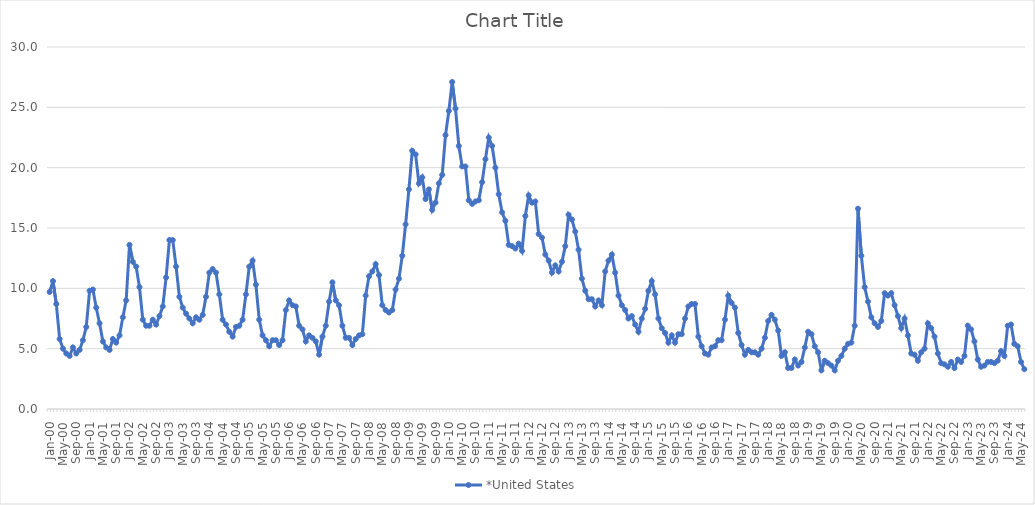
| Category | *United States | Alaska | Alabama | Arkansas | Arizona | California | Colorado | Connecticut | Delaware | Florida | Georgia | Hawaii | Iowa | Idaho | Illinois | Indiana | Kansas | Kentucky | Louisiana | Massachusetts | Maryland | Maine | Michigan | Minnesota | Missouri | Mississippi | Montana | North Carolina | North Dakota | Nebraska | New Hampshire | New Jersey | New Mexico | Nevada | New York | Ohio | Oklahoma | Oregon | Pennsylvania | Rhode Island | South Carolina | South Dakota | Tennessee | Texas | Utah | Virginia | Vermont | Washington | Wisconsin | West Virginia | Wyoming |
|---|---|---|---|---|---|---|---|---|---|---|---|---|---|---|---|---|---|---|---|---|---|---|---|---|---|---|---|---|---|---|---|---|---|---|---|---|---|---|---|---|---|---|---|---|---|---|---|---|---|---|---|
| Jan-00 | 9.7 |  |  |  |  |  |  |  |  |  |  |  |  |  |  |  |  |  |  |  |  |  |  |  |  |  |  |  |  |  |  |  |  |  |  |  |  |  |  |  |  |  |  |  |  |  |  |  |  |  |  |
| Feb-00 | 10.6 |  |  |  |  |  |  |  |  |  |  |  |  |  |  |  |  |  |  |  |  |  |  |  |  |  |  |  |  |  |  |  |  |  |  |  |  |  |  |  |  |  |  |  |  |  |  |  |  |  |  |
| Mar-00 | 8.7 |  |  |  |  |  |  |  |  |  |  |  |  |  |  |  |  |  |  |  |  |  |  |  |  |  |  |  |  |  |  |  |  |  |  |  |  |  |  |  |  |  |  |  |  |  |  |  |  |  |  |
| Apr-00 | 5.8 |  |  |  |  |  |  |  |  |  |  |  |  |  |  |  |  |  |  |  |  |  |  |  |  |  |  |  |  |  |  |  |  |  |  |  |  |  |  |  |  |  |  |  |  |  |  |  |  |  |  |
| May-00 | 5 |  |  |  |  |  |  |  |  |  |  |  |  |  |  |  |  |  |  |  |  |  |  |  |  |  |  |  |  |  |  |  |  |  |  |  |  |  |  |  |  |  |  |  |  |  |  |  |  |  |  |
| Jun-00 | 4.6 |  |  |  |  |  |  |  |  |  |  |  |  |  |  |  |  |  |  |  |  |  |  |  |  |  |  |  |  |  |  |  |  |  |  |  |  |  |  |  |  |  |  |  |  |  |  |  |  |  |  |
| Jul-00 | 4.4 |  |  |  |  |  |  |  |  |  |  |  |  |  |  |  |  |  |  |  |  |  |  |  |  |  |  |  |  |  |  |  |  |  |  |  |  |  |  |  |  |  |  |  |  |  |  |  |  |  |  |
| Aug-00 | 5.1 |  |  |  |  |  |  |  |  |  |  |  |  |  |  |  |  |  |  |  |  |  |  |  |  |  |  |  |  |  |  |  |  |  |  |  |  |  |  |  |  |  |  |  |  |  |  |  |  |  |  |
| Sep-00 | 4.6 |  |  |  |  |  |  |  |  |  |  |  |  |  |  |  |  |  |  |  |  |  |  |  |  |  |  |  |  |  |  |  |  |  |  |  |  |  |  |  |  |  |  |  |  |  |  |  |  |  |  |
| Oct-00 | 4.9 |  |  |  |  |  |  |  |  |  |  |  |  |  |  |  |  |  |  |  |  |  |  |  |  |  |  |  |  |  |  |  |  |  |  |  |  |  |  |  |  |  |  |  |  |  |  |  |  |  |  |
| Nov-00 | 5.7 |  |  |  |  |  |  |  |  |  |  |  |  |  |  |  |  |  |  |  |  |  |  |  |  |  |  |  |  |  |  |  |  |  |  |  |  |  |  |  |  |  |  |  |  |  |  |  |  |  |  |
| Dec-00 | 6.8 |  |  |  |  |  |  |  |  |  |  |  |  |  |  |  |  |  |  |  |  |  |  |  |  |  |  |  |  |  |  |  |  |  |  |  |  |  |  |  |  |  |  |  |  |  |  |  |  |  |  |
| Jan-01 | 9.8 |  |  |  |  |  |  |  |  |  |  |  |  |  |  |  |  |  |  |  |  |  |  |  |  |  |  |  |  |  |  |  |  |  |  |  |  |  |  |  |  |  |  |  |  |  |  |  |  |  |  |
| Feb-01 | 9.9 |  |  |  |  |  |  |  |  |  |  |  |  |  |  |  |  |  |  |  |  |  |  |  |  |  |  |  |  |  |  |  |  |  |  |  |  |  |  |  |  |  |  |  |  |  |  |  |  |  |  |
| Mar-01 | 8.4 |  |  |  |  |  |  |  |  |  |  |  |  |  |  |  |  |  |  |  |  |  |  |  |  |  |  |  |  |  |  |  |  |  |  |  |  |  |  |  |  |  |  |  |  |  |  |  |  |  |  |
| Apr-01 | 7.1 |  |  |  |  |  |  |  |  |  |  |  |  |  |  |  |  |  |  |  |  |  |  |  |  |  |  |  |  |  |  |  |  |  |  |  |  |  |  |  |  |  |  |  |  |  |  |  |  |  |  |
| May-01 | 5.6 |  |  |  |  |  |  |  |  |  |  |  |  |  |  |  |  |  |  |  |  |  |  |  |  |  |  |  |  |  |  |  |  |  |  |  |  |  |  |  |  |  |  |  |  |  |  |  |  |  |  |
| Jun-01 | 5.1 |  |  |  |  |  |  |  |  |  |  |  |  |  |  |  |  |  |  |  |  |  |  |  |  |  |  |  |  |  |  |  |  |  |  |  |  |  |  |  |  |  |  |  |  |  |  |  |  |  |  |
| Jul-01 | 4.9 |  |  |  |  |  |  |  |  |  |  |  |  |  |  |  |  |  |  |  |  |  |  |  |  |  |  |  |  |  |  |  |  |  |  |  |  |  |  |  |  |  |  |  |  |  |  |  |  |  |  |
| Aug-01 | 5.8 |  |  |  |  |  |  |  |  |  |  |  |  |  |  |  |  |  |  |  |  |  |  |  |  |  |  |  |  |  |  |  |  |  |  |  |  |  |  |  |  |  |  |  |  |  |  |  |  |  |  |
| Sep-01 | 5.5 |  |  |  |  |  |  |  |  |  |  |  |  |  |  |  |  |  |  |  |  |  |  |  |  |  |  |  |  |  |  |  |  |  |  |  |  |  |  |  |  |  |  |  |  |  |  |  |  |  |  |
| Oct-01 | 6.1 |  |  |  |  |  |  |  |  |  |  |  |  |  |  |  |  |  |  |  |  |  |  |  |  |  |  |  |  |  |  |  |  |  |  |  |  |  |  |  |  |  |  |  |  |  |  |  |  |  |  |
| Nov-01 | 7.6 |  |  |  |  |  |  |  |  |  |  |  |  |  |  |  |  |  |  |  |  |  |  |  |  |  |  |  |  |  |  |  |  |  |  |  |  |  |  |  |  |  |  |  |  |  |  |  |  |  |  |
| Dec-01 | 9 |  |  |  |  |  |  |  |  |  |  |  |  |  |  |  |  |  |  |  |  |  |  |  |  |  |  |  |  |  |  |  |  |  |  |  |  |  |  |  |  |  |  |  |  |  |  |  |  |  |  |
| Jan-02 | 13.6 |  |  |  |  |  |  |  |  |  |  |  |  |  |  |  |  |  |  |  |  |  |  |  |  |  |  |  |  |  |  |  |  |  |  |  |  |  |  |  |  |  |  |  |  |  |  |  |  |  |  |
| Feb-02 | 12.2 |  |  |  |  |  |  |  |  |  |  |  |  |  |  |  |  |  |  |  |  |  |  |  |  |  |  |  |  |  |  |  |  |  |  |  |  |  |  |  |  |  |  |  |  |  |  |  |  |  |  |
| Mar-02 | 11.8 |  |  |  |  |  |  |  |  |  |  |  |  |  |  |  |  |  |  |  |  |  |  |  |  |  |  |  |  |  |  |  |  |  |  |  |  |  |  |  |  |  |  |  |  |  |  |  |  |  |  |
| Apr-02 | 10.1 |  |  |  |  |  |  |  |  |  |  |  |  |  |  |  |  |  |  |  |  |  |  |  |  |  |  |  |  |  |  |  |  |  |  |  |  |  |  |  |  |  |  |  |  |  |  |  |  |  |  |
| May-02 | 7.4 |  |  |  |  |  |  |  |  |  |  |  |  |  |  |  |  |  |  |  |  |  |  |  |  |  |  |  |  |  |  |  |  |  |  |  |  |  |  |  |  |  |  |  |  |  |  |  |  |  |  |
| Jun-02 | 6.9 |  |  |  |  |  |  |  |  |  |  |  |  |  |  |  |  |  |  |  |  |  |  |  |  |  |  |  |  |  |  |  |  |  |  |  |  |  |  |  |  |  |  |  |  |  |  |  |  |  |  |
| Jul-02 | 6.9 |  |  |  |  |  |  |  |  |  |  |  |  |  |  |  |  |  |  |  |  |  |  |  |  |  |  |  |  |  |  |  |  |  |  |  |  |  |  |  |  |  |  |  |  |  |  |  |  |  |  |
| Aug-02 | 7.4 |  |  |  |  |  |  |  |  |  |  |  |  |  |  |  |  |  |  |  |  |  |  |  |  |  |  |  |  |  |  |  |  |  |  |  |  |  |  |  |  |  |  |  |  |  |  |  |  |  |  |
| Sep-02 | 7 |  |  |  |  |  |  |  |  |  |  |  |  |  |  |  |  |  |  |  |  |  |  |  |  |  |  |  |  |  |  |  |  |  |  |  |  |  |  |  |  |  |  |  |  |  |  |  |  |  |  |
| Oct-02 | 7.7 |  |  |  |  |  |  |  |  |  |  |  |  |  |  |  |  |  |  |  |  |  |  |  |  |  |  |  |  |  |  |  |  |  |  |  |  |  |  |  |  |  |  |  |  |  |  |  |  |  |  |
| Nov-02 | 8.5 |  |  |  |  |  |  |  |  |  |  |  |  |  |  |  |  |  |  |  |  |  |  |  |  |  |  |  |  |  |  |  |  |  |  |  |  |  |  |  |  |  |  |  |  |  |  |  |  |  |  |
| Dec-02 | 10.9 |  |  |  |  |  |  |  |  |  |  |  |  |  |  |  |  |  |  |  |  |  |  |  |  |  |  |  |  |  |  |  |  |  |  |  |  |  |  |  |  |  |  |  |  |  |  |  |  |  |  |
| Jan-03 | 14 |  |  |  |  |  |  |  |  |  |  |  |  |  |  |  |  |  |  |  |  |  |  |  |  |  |  |  |  |  |  |  |  |  |  |  |  |  |  |  |  |  |  |  |  |  |  |  |  |  |  |
| Feb-03 | 14 |  |  |  |  |  |  |  |  |  |  |  |  |  |  |  |  |  |  |  |  |  |  |  |  |  |  |  |  |  |  |  |  |  |  |  |  |  |  |  |  |  |  |  |  |  |  |  |  |  |  |
| Mar-03 | 11.8 |  |  |  |  |  |  |  |  |  |  |  |  |  |  |  |  |  |  |  |  |  |  |  |  |  |  |  |  |  |  |  |  |  |  |  |  |  |  |  |  |  |  |  |  |  |  |  |  |  |  |
| Apr-03 | 9.3 |  |  |  |  |  |  |  |  |  |  |  |  |  |  |  |  |  |  |  |  |  |  |  |  |  |  |  |  |  |  |  |  |  |  |  |  |  |  |  |  |  |  |  |  |  |  |  |  |  |  |
| May-03 | 8.4 |  |  |  |  |  |  |  |  |  |  |  |  |  |  |  |  |  |  |  |  |  |  |  |  |  |  |  |  |  |  |  |  |  |  |  |  |  |  |  |  |  |  |  |  |  |  |  |  |  |  |
| Jun-03 | 7.9 |  |  |  |  |  |  |  |  |  |  |  |  |  |  |  |  |  |  |  |  |  |  |  |  |  |  |  |  |  |  |  |  |  |  |  |  |  |  |  |  |  |  |  |  |  |  |  |  |  |  |
| Jul-03 | 7.5 |  |  |  |  |  |  |  |  |  |  |  |  |  |  |  |  |  |  |  |  |  |  |  |  |  |  |  |  |  |  |  |  |  |  |  |  |  |  |  |  |  |  |  |  |  |  |  |  |  |  |
| Aug-03 | 7.1 |  |  |  |  |  |  |  |  |  |  |  |  |  |  |  |  |  |  |  |  |  |  |  |  |  |  |  |  |  |  |  |  |  |  |  |  |  |  |  |  |  |  |  |  |  |  |  |  |  |  |
| Sep-03 | 7.6 |  |  |  |  |  |  |  |  |  |  |  |  |  |  |  |  |  |  |  |  |  |  |  |  |  |  |  |  |  |  |  |  |  |  |  |  |  |  |  |  |  |  |  |  |  |  |  |  |  |  |
| Oct-03 | 7.4 |  |  |  |  |  |  |  |  |  |  |  |  |  |  |  |  |  |  |  |  |  |  |  |  |  |  |  |  |  |  |  |  |  |  |  |  |  |  |  |  |  |  |  |  |  |  |  |  |  |  |
| Nov-03 | 7.8 |  |  |  |  |  |  |  |  |  |  |  |  |  |  |  |  |  |  |  |  |  |  |  |  |  |  |  |  |  |  |  |  |  |  |  |  |  |  |  |  |  |  |  |  |  |  |  |  |  |  |
| Dec-03 | 9.3 |  |  |  |  |  |  |  |  |  |  |  |  |  |  |  |  |  |  |  |  |  |  |  |  |  |  |  |  |  |  |  |  |  |  |  |  |  |  |  |  |  |  |  |  |  |  |  |  |  |  |
| Jan-04 | 11.3 |  |  |  |  |  |  |  |  |  |  |  |  |  |  |  |  |  |  |  |  |  |  |  |  |  |  |  |  |  |  |  |  |  |  |  |  |  |  |  |  |  |  |  |  |  |  |  |  |  |  |
| Feb-04 | 11.6 |  |  |  |  |  |  |  |  |  |  |  |  |  |  |  |  |  |  |  |  |  |  |  |  |  |  |  |  |  |  |  |  |  |  |  |  |  |  |  |  |  |  |  |  |  |  |  |  |  |  |
| Mar-04 | 11.3 |  |  |  |  |  |  |  |  |  |  |  |  |  |  |  |  |  |  |  |  |  |  |  |  |  |  |  |  |  |  |  |  |  |  |  |  |  |  |  |  |  |  |  |  |  |  |  |  |  |  |
| Apr-04 | 9.5 |  |  |  |  |  |  |  |  |  |  |  |  |  |  |  |  |  |  |  |  |  |  |  |  |  |  |  |  |  |  |  |  |  |  |  |  |  |  |  |  |  |  |  |  |  |  |  |  |  |  |
| May-04 | 7.4 |  |  |  |  |  |  |  |  |  |  |  |  |  |  |  |  |  |  |  |  |  |  |  |  |  |  |  |  |  |  |  |  |  |  |  |  |  |  |  |  |  |  |  |  |  |  |  |  |  |  |
| Jun-04 | 7 |  |  |  |  |  |  |  |  |  |  |  |  |  |  |  |  |  |  |  |  |  |  |  |  |  |  |  |  |  |  |  |  |  |  |  |  |  |  |  |  |  |  |  |  |  |  |  |  |  |  |
| Jul-04 | 6.4 |  |  |  |  |  |  |  |  |  |  |  |  |  |  |  |  |  |  |  |  |  |  |  |  |  |  |  |  |  |  |  |  |  |  |  |  |  |  |  |  |  |  |  |  |  |  |  |  |  |  |
| Aug-04 | 6 |  |  |  |  |  |  |  |  |  |  |  |  |  |  |  |  |  |  |  |  |  |  |  |  |  |  |  |  |  |  |  |  |  |  |  |  |  |  |  |  |  |  |  |  |  |  |  |  |  |  |
| Sep-04 | 6.8 |  |  |  |  |  |  |  |  |  |  |  |  |  |  |  |  |  |  |  |  |  |  |  |  |  |  |  |  |  |  |  |  |  |  |  |  |  |  |  |  |  |  |  |  |  |  |  |  |  |  |
| Oct-04 | 6.9 |  |  |  |  |  |  |  |  |  |  |  |  |  |  |  |  |  |  |  |  |  |  |  |  |  |  |  |  |  |  |  |  |  |  |  |  |  |  |  |  |  |  |  |  |  |  |  |  |  |  |
| Nov-04 | 7.4 |  |  |  |  |  |  |  |  |  |  |  |  |  |  |  |  |  |  |  |  |  |  |  |  |  |  |  |  |  |  |  |  |  |  |  |  |  |  |  |  |  |  |  |  |  |  |  |  |  |  |
| Dec-04 | 9.5 |  |  |  |  |  |  |  |  |  |  |  |  |  |  |  |  |  |  |  |  |  |  |  |  |  |  |  |  |  |  |  |  |  |  |  |  |  |  |  |  |  |  |  |  |  |  |  |  |  |  |
| Jan-05 | 11.8 |  |  |  |  |  |  |  |  |  |  |  |  |  |  |  |  |  |  |  |  |  |  |  |  |  |  |  |  |  |  |  |  |  |  |  |  |  |  |  |  |  |  |  |  |  |  |  |  |  |  |
| Feb-05 | 12.3 |  |  |  |  |  |  |  |  |  |  |  |  |  |  |  |  |  |  |  |  |  |  |  |  |  |  |  |  |  |  |  |  |  |  |  |  |  |  |  |  |  |  |  |  |  |  |  |  |  |  |
| Mar-05 | 10.3 |  |  |  |  |  |  |  |  |  |  |  |  |  |  |  |  |  |  |  |  |  |  |  |  |  |  |  |  |  |  |  |  |  |  |  |  |  |  |  |  |  |  |  |  |  |  |  |  |  |  |
| Apr-05 | 7.4 |  |  |  |  |  |  |  |  |  |  |  |  |  |  |  |  |  |  |  |  |  |  |  |  |  |  |  |  |  |  |  |  |  |  |  |  |  |  |  |  |  |  |  |  |  |  |  |  |  |  |
| May-05 | 6.1 |  |  |  |  |  |  |  |  |  |  |  |  |  |  |  |  |  |  |  |  |  |  |  |  |  |  |  |  |  |  |  |  |  |  |  |  |  |  |  |  |  |  |  |  |  |  |  |  |  |  |
| Jun-05 | 5.7 |  |  |  |  |  |  |  |  |  |  |  |  |  |  |  |  |  |  |  |  |  |  |  |  |  |  |  |  |  |  |  |  |  |  |  |  |  |  |  |  |  |  |  |  |  |  |  |  |  |  |
| Jul-05 | 5.2 |  |  |  |  |  |  |  |  |  |  |  |  |  |  |  |  |  |  |  |  |  |  |  |  |  |  |  |  |  |  |  |  |  |  |  |  |  |  |  |  |  |  |  |  |  |  |  |  |  |  |
| Aug-05 | 5.7 |  |  |  |  |  |  |  |  |  |  |  |  |  |  |  |  |  |  |  |  |  |  |  |  |  |  |  |  |  |  |  |  |  |  |  |  |  |  |  |  |  |  |  |  |  |  |  |  |  |  |
| Sep-05 | 5.7 |  |  |  |  |  |  |  |  |  |  |  |  |  |  |  |  |  |  |  |  |  |  |  |  |  |  |  |  |  |  |  |  |  |  |  |  |  |  |  |  |  |  |  |  |  |  |  |  |  |  |
| Oct-05 | 5.3 |  |  |  |  |  |  |  |  |  |  |  |  |  |  |  |  |  |  |  |  |  |  |  |  |  |  |  |  |  |  |  |  |  |  |  |  |  |  |  |  |  |  |  |  |  |  |  |  |  |  |
| Nov-05 | 5.7 |  |  |  |  |  |  |  |  |  |  |  |  |  |  |  |  |  |  |  |  |  |  |  |  |  |  |  |  |  |  |  |  |  |  |  |  |  |  |  |  |  |  |  |  |  |  |  |  |  |  |
| Dec-05 | 8.2 |  |  |  |  |  |  |  |  |  |  |  |  |  |  |  |  |  |  |  |  |  |  |  |  |  |  |  |  |  |  |  |  |  |  |  |  |  |  |  |  |  |  |  |  |  |  |  |  |  |  |
| Jan-06 | 9 |  |  |  |  |  |  |  |  |  |  |  |  |  |  |  |  |  |  |  |  |  |  |  |  |  |  |  |  |  |  |  |  |  |  |  |  |  |  |  |  |  |  |  |  |  |  |  |  |  |  |
| Feb-06 | 8.6 |  |  |  |  |  |  |  |  |  |  |  |  |  |  |  |  |  |  |  |  |  |  |  |  |  |  |  |  |  |  |  |  |  |  |  |  |  |  |  |  |  |  |  |  |  |  |  |  |  |  |
| Mar-06 | 8.5 |  |  |  |  |  |  |  |  |  |  |  |  |  |  |  |  |  |  |  |  |  |  |  |  |  |  |  |  |  |  |  |  |  |  |  |  |  |  |  |  |  |  |  |  |  |  |  |  |  |  |
| Apr-06 | 6.9 |  |  |  |  |  |  |  |  |  |  |  |  |  |  |  |  |  |  |  |  |  |  |  |  |  |  |  |  |  |  |  |  |  |  |  |  |  |  |  |  |  |  |  |  |  |  |  |  |  |  |
| May-06 | 6.6 |  |  |  |  |  |  |  |  |  |  |  |  |  |  |  |  |  |  |  |  |  |  |  |  |  |  |  |  |  |  |  |  |  |  |  |  |  |  |  |  |  |  |  |  |  |  |  |  |  |  |
| Jun-06 | 5.6 |  |  |  |  |  |  |  |  |  |  |  |  |  |  |  |  |  |  |  |  |  |  |  |  |  |  |  |  |  |  |  |  |  |  |  |  |  |  |  |  |  |  |  |  |  |  |  |  |  |  |
| Jul-06 | 6.1 |  |  |  |  |  |  |  |  |  |  |  |  |  |  |  |  |  |  |  |  |  |  |  |  |  |  |  |  |  |  |  |  |  |  |  |  |  |  |  |  |  |  |  |  |  |  |  |  |  |  |
| Aug-06 | 5.9 |  |  |  |  |  |  |  |  |  |  |  |  |  |  |  |  |  |  |  |  |  |  |  |  |  |  |  |  |  |  |  |  |  |  |  |  |  |  |  |  |  |  |  |  |  |  |  |  |  |  |
| Sep-06 | 5.6 |  |  |  |  |  |  |  |  |  |  |  |  |  |  |  |  |  |  |  |  |  |  |  |  |  |  |  |  |  |  |  |  |  |  |  |  |  |  |  |  |  |  |  |  |  |  |  |  |  |  |
| Oct-06 | 4.5 |  |  |  |  |  |  |  |  |  |  |  |  |  |  |  |  |  |  |  |  |  |  |  |  |  |  |  |  |  |  |  |  |  |  |  |  |  |  |  |  |  |  |  |  |  |  |  |  |  |  |
| Nov-06 | 6 |  |  |  |  |  |  |  |  |  |  |  |  |  |  |  |  |  |  |  |  |  |  |  |  |  |  |  |  |  |  |  |  |  |  |  |  |  |  |  |  |  |  |  |  |  |  |  |  |  |  |
| Dec-06 | 6.9 |  |  |  |  |  |  |  |  |  |  |  |  |  |  |  |  |  |  |  |  |  |  |  |  |  |  |  |  |  |  |  |  |  |  |  |  |  |  |  |  |  |  |  |  |  |  |  |  |  |  |
| Jan-07 | 8.9 |  |  |  |  |  |  |  |  |  |  |  |  |  |  |  |  |  |  |  |  |  |  |  |  |  |  |  |  |  |  |  |  |  |  |  |  |  |  |  |  |  |  |  |  |  |  |  |  |  |  |
| Feb-07 | 10.5 |  |  |  |  |  |  |  |  |  |  |  |  |  |  |  |  |  |  |  |  |  |  |  |  |  |  |  |  |  |  |  |  |  |  |  |  |  |  |  |  |  |  |  |  |  |  |  |  |  |  |
| Mar-07 | 9 |  |  |  |  |  |  |  |  |  |  |  |  |  |  |  |  |  |  |  |  |  |  |  |  |  |  |  |  |  |  |  |  |  |  |  |  |  |  |  |  |  |  |  |  |  |  |  |  |  |  |
| Apr-07 | 8.6 |  |  |  |  |  |  |  |  |  |  |  |  |  |  |  |  |  |  |  |  |  |  |  |  |  |  |  |  |  |  |  |  |  |  |  |  |  |  |  |  |  |  |  |  |  |  |  |  |  |  |
| May-07 | 6.9 |  |  |  |  |  |  |  |  |  |  |  |  |  |  |  |  |  |  |  |  |  |  |  |  |  |  |  |  |  |  |  |  |  |  |  |  |  |  |  |  |  |  |  |  |  |  |  |  |  |  |
| Jun-07 | 5.9 |  |  |  |  |  |  |  |  |  |  |  |  |  |  |  |  |  |  |  |  |  |  |  |  |  |  |  |  |  |  |  |  |  |  |  |  |  |  |  |  |  |  |  |  |  |  |  |  |  |  |
| Jul-07 | 5.9 |  |  |  |  |  |  |  |  |  |  |  |  |  |  |  |  |  |  |  |  |  |  |  |  |  |  |  |  |  |  |  |  |  |  |  |  |  |  |  |  |  |  |  |  |  |  |  |  |  |  |
| Aug-07 | 5.3 |  |  |  |  |  |  |  |  |  |  |  |  |  |  |  |  |  |  |  |  |  |  |  |  |  |  |  |  |  |  |  |  |  |  |  |  |  |  |  |  |  |  |  |  |  |  |  |  |  |  |
| Sep-07 | 5.8 |  |  |  |  |  |  |  |  |  |  |  |  |  |  |  |  |  |  |  |  |  |  |  |  |  |  |  |  |  |  |  |  |  |  |  |  |  |  |  |  |  |  |  |  |  |  |  |  |  |  |
| Oct-07 | 6.1 |  |  |  |  |  |  |  |  |  |  |  |  |  |  |  |  |  |  |  |  |  |  |  |  |  |  |  |  |  |  |  |  |  |  |  |  |  |  |  |  |  |  |  |  |  |  |  |  |  |  |
| Nov-07 | 6.2 |  |  |  |  |  |  |  |  |  |  |  |  |  |  |  |  |  |  |  |  |  |  |  |  |  |  |  |  |  |  |  |  |  |  |  |  |  |  |  |  |  |  |  |  |  |  |  |  |  |  |
| Dec-07 | 9.4 |  |  |  |  |  |  |  |  |  |  |  |  |  |  |  |  |  |  |  |  |  |  |  |  |  |  |  |  |  |  |  |  |  |  |  |  |  |  |  |  |  |  |  |  |  |  |  |  |  |  |
| Jan-08 | 11 |  |  |  |  |  |  |  |  |  |  |  |  |  |  |  |  |  |  |  |  |  |  |  |  |  |  |  |  |  |  |  |  |  |  |  |  |  |  |  |  |  |  |  |  |  |  |  |  |  |  |
| Feb-08 | 11.4 |  |  |  |  |  |  |  |  |  |  |  |  |  |  |  |  |  |  |  |  |  |  |  |  |  |  |  |  |  |  |  |  |  |  |  |  |  |  |  |  |  |  |  |  |  |  |  |  |  |  |
| Mar-08 | 12 |  |  |  |  |  |  |  |  |  |  |  |  |  |  |  |  |  |  |  |  |  |  |  |  |  |  |  |  |  |  |  |  |  |  |  |  |  |  |  |  |  |  |  |  |  |  |  |  |  |  |
| Apr-08 | 11.1 |  |  |  |  |  |  |  |  |  |  |  |  |  |  |  |  |  |  |  |  |  |  |  |  |  |  |  |  |  |  |  |  |  |  |  |  |  |  |  |  |  |  |  |  |  |  |  |  |  |  |
| May-08 | 8.6 |  |  |  |  |  |  |  |  |  |  |  |  |  |  |  |  |  |  |  |  |  |  |  |  |  |  |  |  |  |  |  |  |  |  |  |  |  |  |  |  |  |  |  |  |  |  |  |  |  |  |
| Jun-08 | 8.2 |  |  |  |  |  |  |  |  |  |  |  |  |  |  |  |  |  |  |  |  |  |  |  |  |  |  |  |  |  |  |  |  |  |  |  |  |  |  |  |  |  |  |  |  |  |  |  |  |  |  |
| Jul-08 | 8 |  |  |  |  |  |  |  |  |  |  |  |  |  |  |  |  |  |  |  |  |  |  |  |  |  |  |  |  |  |  |  |  |  |  |  |  |  |  |  |  |  |  |  |  |  |  |  |  |  |  |
| Aug-08 | 8.2 |  |  |  |  |  |  |  |  |  |  |  |  |  |  |  |  |  |  |  |  |  |  |  |  |  |  |  |  |  |  |  |  |  |  |  |  |  |  |  |  |  |  |  |  |  |  |  |  |  |  |
| Sep-08 | 9.9 |  |  |  |  |  |  |  |  |  |  |  |  |  |  |  |  |  |  |  |  |  |  |  |  |  |  |  |  |  |  |  |  |  |  |  |  |  |  |  |  |  |  |  |  |  |  |  |  |  |  |
| Oct-08 | 10.8 |  |  |  |  |  |  |  |  |  |  |  |  |  |  |  |  |  |  |  |  |  |  |  |  |  |  |  |  |  |  |  |  |  |  |  |  |  |  |  |  |  |  |  |  |  |  |  |  |  |  |
| Nov-08 | 12.7 |  |  |  |  |  |  |  |  |  |  |  |  |  |  |  |  |  |  |  |  |  |  |  |  |  |  |  |  |  |  |  |  |  |  |  |  |  |  |  |  |  |  |  |  |  |  |  |  |  |  |
| Dec-08 | 15.3 |  |  |  |  |  |  |  |  |  |  |  |  |  |  |  |  |  |  |  |  |  |  |  |  |  |  |  |  |  |  |  |  |  |  |  |  |  |  |  |  |  |  |  |  |  |  |  |  |  |  |
| Jan-09 | 18.2 |  |  |  |  |  |  |  |  |  |  |  |  |  |  |  |  |  |  |  |  |  |  |  |  |  |  |  |  |  |  |  |  |  |  |  |  |  |  |  |  |  |  |  |  |  |  |  |  |  |  |
| Feb-09 | 21.4 |  |  |  |  |  |  |  |  |  |  |  |  |  |  |  |  |  |  |  |  |  |  |  |  |  |  |  |  |  |  |  |  |  |  |  |  |  |  |  |  |  |  |  |  |  |  |  |  |  |  |
| Mar-09 | 21.1 |  |  |  |  |  |  |  |  |  |  |  |  |  |  |  |  |  |  |  |  |  |  |  |  |  |  |  |  |  |  |  |  |  |  |  |  |  |  |  |  |  |  |  |  |  |  |  |  |  |  |
| Apr-09 | 18.7 |  |  |  |  |  |  |  |  |  |  |  |  |  |  |  |  |  |  |  |  |  |  |  |  |  |  |  |  |  |  |  |  |  |  |  |  |  |  |  |  |  |  |  |  |  |  |  |  |  |  |
| May-09 | 19.2 |  |  |  |  |  |  |  |  |  |  |  |  |  |  |  |  |  |  |  |  |  |  |  |  |  |  |  |  |  |  |  |  |  |  |  |  |  |  |  |  |  |  |  |  |  |  |  |  |  |  |
| Jun-09 | 17.4 |  |  |  |  |  |  |  |  |  |  |  |  |  |  |  |  |  |  |  |  |  |  |  |  |  |  |  |  |  |  |  |  |  |  |  |  |  |  |  |  |  |  |  |  |  |  |  |  |  |  |
| Jul-09 | 18.2 |  |  |  |  |  |  |  |  |  |  |  |  |  |  |  |  |  |  |  |  |  |  |  |  |  |  |  |  |  |  |  |  |  |  |  |  |  |  |  |  |  |  |  |  |  |  |  |  |  |  |
| Aug-09 | 16.5 |  |  |  |  |  |  |  |  |  |  |  |  |  |  |  |  |  |  |  |  |  |  |  |  |  |  |  |  |  |  |  |  |  |  |  |  |  |  |  |  |  |  |  |  |  |  |  |  |  |  |
| Sep-09 | 17.1 |  |  |  |  |  |  |  |  |  |  |  |  |  |  |  |  |  |  |  |  |  |  |  |  |  |  |  |  |  |  |  |  |  |  |  |  |  |  |  |  |  |  |  |  |  |  |  |  |  |  |
| Oct-09 | 18.7 |  |  |  |  |  |  |  |  |  |  |  |  |  |  |  |  |  |  |  |  |  |  |  |  |  |  |  |  |  |  |  |  |  |  |  |  |  |  |  |  |  |  |  |  |  |  |  |  |  |  |
| Nov-09 | 19.4 |  |  |  |  |  |  |  |  |  |  |  |  |  |  |  |  |  |  |  |  |  |  |  |  |  |  |  |  |  |  |  |  |  |  |  |  |  |  |  |  |  |  |  |  |  |  |  |  |  |  |
| Dec-09 | 22.7 |  |  |  |  |  |  |  |  |  |  |  |  |  |  |  |  |  |  |  |  |  |  |  |  |  |  |  |  |  |  |  |  |  |  |  |  |  |  |  |  |  |  |  |  |  |  |  |  |  |  |
| Jan-10 | 24.7 |  |  |  |  |  |  |  |  |  |  |  |  |  |  |  |  |  |  |  |  |  |  |  |  |  |  |  |  |  |  |  |  |  |  |  |  |  |  |  |  |  |  |  |  |  |  |  |  |  |  |
| Feb-10 | 27.1 |  |  |  |  |  |  |  |  |  |  |  |  |  |  |  |  |  |  |  |  |  |  |  |  |  |  |  |  |  |  |  |  |  |  |  |  |  |  |  |  |  |  |  |  |  |  |  |  |  |  |
| Mar-10 | 24.9 |  |  |  |  |  |  |  |  |  |  |  |  |  |  |  |  |  |  |  |  |  |  |  |  |  |  |  |  |  |  |  |  |  |  |  |  |  |  |  |  |  |  |  |  |  |  |  |  |  |  |
| Apr-10 | 21.8 |  |  |  |  |  |  |  |  |  |  |  |  |  |  |  |  |  |  |  |  |  |  |  |  |  |  |  |  |  |  |  |  |  |  |  |  |  |  |  |  |  |  |  |  |  |  |  |  |  |  |
| May-10 | 20.1 |  |  |  |  |  |  |  |  |  |  |  |  |  |  |  |  |  |  |  |  |  |  |  |  |  |  |  |  |  |  |  |  |  |  |  |  |  |  |  |  |  |  |  |  |  |  |  |  |  |  |
| Jun-10 | 20.1 |  |  |  |  |  |  |  |  |  |  |  |  |  |  |  |  |  |  |  |  |  |  |  |  |  |  |  |  |  |  |  |  |  |  |  |  |  |  |  |  |  |  |  |  |  |  |  |  |  |  |
| Jul-10 | 17.3 |  |  |  |  |  |  |  |  |  |  |  |  |  |  |  |  |  |  |  |  |  |  |  |  |  |  |  |  |  |  |  |  |  |  |  |  |  |  |  |  |  |  |  |  |  |  |  |  |  |  |
| Aug-10 | 17 |  |  |  |  |  |  |  |  |  |  |  |  |  |  |  |  |  |  |  |  |  |  |  |  |  |  |  |  |  |  |  |  |  |  |  |  |  |  |  |  |  |  |  |  |  |  |  |  |  |  |
| Sep-10 | 17.2 |  |  |  |  |  |  |  |  |  |  |  |  |  |  |  |  |  |  |  |  |  |  |  |  |  |  |  |  |  |  |  |  |  |  |  |  |  |  |  |  |  |  |  |  |  |  |  |  |  |  |
| Oct-10 | 17.3 |  |  |  |  |  |  |  |  |  |  |  |  |  |  |  |  |  |  |  |  |  |  |  |  |  |  |  |  |  |  |  |  |  |  |  |  |  |  |  |  |  |  |  |  |  |  |  |  |  |  |
| Nov-10 | 18.8 |  |  |  |  |  |  |  |  |  |  |  |  |  |  |  |  |  |  |  |  |  |  |  |  |  |  |  |  |  |  |  |  |  |  |  |  |  |  |  |  |  |  |  |  |  |  |  |  |  |  |
| Dec-10 | 20.7 |  |  |  |  |  |  |  |  |  |  |  |  |  |  |  |  |  |  |  |  |  |  |  |  |  |  |  |  |  |  |  |  |  |  |  |  |  |  |  |  |  |  |  |  |  |  |  |  |  |  |
| Jan-11 | 22.5 |  |  |  |  |  |  |  |  |  |  |  |  |  |  |  |  |  |  |  |  |  |  |  |  |  |  |  |  |  |  |  |  |  |  |  |  |  |  |  |  |  |  |  |  |  |  |  |  |  |  |
| Feb-11 | 21.8 |  |  |  |  |  |  |  |  |  |  |  |  |  |  |  |  |  |  |  |  |  |  |  |  |  |  |  |  |  |  |  |  |  |  |  |  |  |  |  |  |  |  |  |  |  |  |  |  |  |  |
| Mar-11 | 20 |  |  |  |  |  |  |  |  |  |  |  |  |  |  |  |  |  |  |  |  |  |  |  |  |  |  |  |  |  |  |  |  |  |  |  |  |  |  |  |  |  |  |  |  |  |  |  |  |  |  |
| Apr-11 | 17.8 |  |  |  |  |  |  |  |  |  |  |  |  |  |  |  |  |  |  |  |  |  |  |  |  |  |  |  |  |  |  |  |  |  |  |  |  |  |  |  |  |  |  |  |  |  |  |  |  |  |  |
| May-11 | 16.3 |  |  |  |  |  |  |  |  |  |  |  |  |  |  |  |  |  |  |  |  |  |  |  |  |  |  |  |  |  |  |  |  |  |  |  |  |  |  |  |  |  |  |  |  |  |  |  |  |  |  |
| Jun-11 | 15.6 |  |  |  |  |  |  |  |  |  |  |  |  |  |  |  |  |  |  |  |  |  |  |  |  |  |  |  |  |  |  |  |  |  |  |  |  |  |  |  |  |  |  |  |  |  |  |  |  |  |  |
| Jul-11 | 13.6 |  |  |  |  |  |  |  |  |  |  |  |  |  |  |  |  |  |  |  |  |  |  |  |  |  |  |  |  |  |  |  |  |  |  |  |  |  |  |  |  |  |  |  |  |  |  |  |  |  |  |
| Aug-11 | 13.5 |  |  |  |  |  |  |  |  |  |  |  |  |  |  |  |  |  |  |  |  |  |  |  |  |  |  |  |  |  |  |  |  |  |  |  |  |  |  |  |  |  |  |  |  |  |  |  |  |  |  |
| Sep-11 | 13.3 |  |  |  |  |  |  |  |  |  |  |  |  |  |  |  |  |  |  |  |  |  |  |  |  |  |  |  |  |  |  |  |  |  |  |  |  |  |  |  |  |  |  |  |  |  |  |  |  |  |  |
| Oct-11 | 13.7 |  |  |  |  |  |  |  |  |  |  |  |  |  |  |  |  |  |  |  |  |  |  |  |  |  |  |  |  |  |  |  |  |  |  |  |  |  |  |  |  |  |  |  |  |  |  |  |  |  |  |
| Nov-11 | 13.1 |  |  |  |  |  |  |  |  |  |  |  |  |  |  |  |  |  |  |  |  |  |  |  |  |  |  |  |  |  |  |  |  |  |  |  |  |  |  |  |  |  |  |  |  |  |  |  |  |  |  |
| Dec-11 | 16 |  |  |  |  |  |  |  |  |  |  |  |  |  |  |  |  |  |  |  |  |  |  |  |  |  |  |  |  |  |  |  |  |  |  |  |  |  |  |  |  |  |  |  |  |  |  |  |  |  |  |
| Jan-12 | 17.7 |  |  |  |  |  |  |  |  |  |  |  |  |  |  |  |  |  |  |  |  |  |  |  |  |  |  |  |  |  |  |  |  |  |  |  |  |  |  |  |  |  |  |  |  |  |  |  |  |  |  |
| Feb-12 | 17.1 |  |  |  |  |  |  |  |  |  |  |  |  |  |  |  |  |  |  |  |  |  |  |  |  |  |  |  |  |  |  |  |  |  |  |  |  |  |  |  |  |  |  |  |  |  |  |  |  |  |  |
| Mar-12 | 17.2 |  |  |  |  |  |  |  |  |  |  |  |  |  |  |  |  |  |  |  |  |  |  |  |  |  |  |  |  |  |  |  |  |  |  |  |  |  |  |  |  |  |  |  |  |  |  |  |  |  |  |
| Apr-12 | 14.5 |  |  |  |  |  |  |  |  |  |  |  |  |  |  |  |  |  |  |  |  |  |  |  |  |  |  |  |  |  |  |  |  |  |  |  |  |  |  |  |  |  |  |  |  |  |  |  |  |  |  |
| May-12 | 14.2 |  |  |  |  |  |  |  |  |  |  |  |  |  |  |  |  |  |  |  |  |  |  |  |  |  |  |  |  |  |  |  |  |  |  |  |  |  |  |  |  |  |  |  |  |  |  |  |  |  |  |
| Jun-12 | 12.8 |  |  |  |  |  |  |  |  |  |  |  |  |  |  |  |  |  |  |  |  |  |  |  |  |  |  |  |  |  |  |  |  |  |  |  |  |  |  |  |  |  |  |  |  |  |  |  |  |  |  |
| Jul-12 | 12.3 |  |  |  |  |  |  |  |  |  |  |  |  |  |  |  |  |  |  |  |  |  |  |  |  |  |  |  |  |  |  |  |  |  |  |  |  |  |  |  |  |  |  |  |  |  |  |  |  |  |  |
| Aug-12 | 11.3 |  |  |  |  |  |  |  |  |  |  |  |  |  |  |  |  |  |  |  |  |  |  |  |  |  |  |  |  |  |  |  |  |  |  |  |  |  |  |  |  |  |  |  |  |  |  |  |  |  |  |
| Sep-12 | 11.9 |  |  |  |  |  |  |  |  |  |  |  |  |  |  |  |  |  |  |  |  |  |  |  |  |  |  |  |  |  |  |  |  |  |  |  |  |  |  |  |  |  |  |  |  |  |  |  |  |  |  |
| Oct-12 | 11.4 |  |  |  |  |  |  |  |  |  |  |  |  |  |  |  |  |  |  |  |  |  |  |  |  |  |  |  |  |  |  |  |  |  |  |  |  |  |  |  |  |  |  |  |  |  |  |  |  |  |  |
| Nov-12 | 12.2 |  |  |  |  |  |  |  |  |  |  |  |  |  |  |  |  |  |  |  |  |  |  |  |  |  |  |  |  |  |  |  |  |  |  |  |  |  |  |  |  |  |  |  |  |  |  |  |  |  |  |
| Dec-12 | 13.5 |  |  |  |  |  |  |  |  |  |  |  |  |  |  |  |  |  |  |  |  |  |  |  |  |  |  |  |  |  |  |  |  |  |  |  |  |  |  |  |  |  |  |  |  |  |  |  |  |  |  |
| Jan-13 | 16.1 |  |  |  |  |  |  |  |  |  |  |  |  |  |  |  |  |  |  |  |  |  |  |  |  |  |  |  |  |  |  |  |  |  |  |  |  |  |  |  |  |  |  |  |  |  |  |  |  |  |  |
| Feb-13 | 15.7 |  |  |  |  |  |  |  |  |  |  |  |  |  |  |  |  |  |  |  |  |  |  |  |  |  |  |  |  |  |  |  |  |  |  |  |  |  |  |  |  |  |  |  |  |  |  |  |  |  |  |
| Mar-13 | 14.7 |  |  |  |  |  |  |  |  |  |  |  |  |  |  |  |  |  |  |  |  |  |  |  |  |  |  |  |  |  |  |  |  |  |  |  |  |  |  |  |  |  |  |  |  |  |  |  |  |  |  |
| Apr-13 | 13.2 |  |  |  |  |  |  |  |  |  |  |  |  |  |  |  |  |  |  |  |  |  |  |  |  |  |  |  |  |  |  |  |  |  |  |  |  |  |  |  |  |  |  |  |  |  |  |  |  |  |  |
| May-13 | 10.8 |  |  |  |  |  |  |  |  |  |  |  |  |  |  |  |  |  |  |  |  |  |  |  |  |  |  |  |  |  |  |  |  |  |  |  |  |  |  |  |  |  |  |  |  |  |  |  |  |  |  |
| Jun-13 | 9.8 |  |  |  |  |  |  |  |  |  |  |  |  |  |  |  |  |  |  |  |  |  |  |  |  |  |  |  |  |  |  |  |  |  |  |  |  |  |  |  |  |  |  |  |  |  |  |  |  |  |  |
| Jul-13 | 9.1 |  |  |  |  |  |  |  |  |  |  |  |  |  |  |  |  |  |  |  |  |  |  |  |  |  |  |  |  |  |  |  |  |  |  |  |  |  |  |  |  |  |  |  |  |  |  |  |  |  |  |
| Aug-13 | 9.1 |  |  |  |  |  |  |  |  |  |  |  |  |  |  |  |  |  |  |  |  |  |  |  |  |  |  |  |  |  |  |  |  |  |  |  |  |  |  |  |  |  |  |  |  |  |  |  |  |  |  |
| Sep-13 | 8.5 |  |  |  |  |  |  |  |  |  |  |  |  |  |  |  |  |  |  |  |  |  |  |  |  |  |  |  |  |  |  |  |  |  |  |  |  |  |  |  |  |  |  |  |  |  |  |  |  |  |  |
| Oct-13 | 9 |  |  |  |  |  |  |  |  |  |  |  |  |  |  |  |  |  |  |  |  |  |  |  |  |  |  |  |  |  |  |  |  |  |  |  |  |  |  |  |  |  |  |  |  |  |  |  |  |  |  |
| Nov-13 | 8.6 |  |  |  |  |  |  |  |  |  |  |  |  |  |  |  |  |  |  |  |  |  |  |  |  |  |  |  |  |  |  |  |  |  |  |  |  |  |  |  |  |  |  |  |  |  |  |  |  |  |  |
| Dec-13 | 11.4 |  |  |  |  |  |  |  |  |  |  |  |  |  |  |  |  |  |  |  |  |  |  |  |  |  |  |  |  |  |  |  |  |  |  |  |  |  |  |  |  |  |  |  |  |  |  |  |  |  |  |
| Jan-14 | 12.3 |  |  |  |  |  |  |  |  |  |  |  |  |  |  |  |  |  |  |  |  |  |  |  |  |  |  |  |  |  |  |  |  |  |  |  |  |  |  |  |  |  |  |  |  |  |  |  |  |  |  |
| Feb-14 | 12.8 |  |  |  |  |  |  |  |  |  |  |  |  |  |  |  |  |  |  |  |  |  |  |  |  |  |  |  |  |  |  |  |  |  |  |  |  |  |  |  |  |  |  |  |  |  |  |  |  |  |  |
| Mar-14 | 11.3 |  |  |  |  |  |  |  |  |  |  |  |  |  |  |  |  |  |  |  |  |  |  |  |  |  |  |  |  |  |  |  |  |  |  |  |  |  |  |  |  |  |  |  |  |  |  |  |  |  |  |
| Apr-14 | 9.4 |  |  |  |  |  |  |  |  |  |  |  |  |  |  |  |  |  |  |  |  |  |  |  |  |  |  |  |  |  |  |  |  |  |  |  |  |  |  |  |  |  |  |  |  |  |  |  |  |  |  |
| May-14 | 8.6 |  |  |  |  |  |  |  |  |  |  |  |  |  |  |  |  |  |  |  |  |  |  |  |  |  |  |  |  |  |  |  |  |  |  |  |  |  |  |  |  |  |  |  |  |  |  |  |  |  |  |
| Jun-14 | 8.2 |  |  |  |  |  |  |  |  |  |  |  |  |  |  |  |  |  |  |  |  |  |  |  |  |  |  |  |  |  |  |  |  |  |  |  |  |  |  |  |  |  |  |  |  |  |  |  |  |  |  |
| Jul-14 | 7.5 |  |  |  |  |  |  |  |  |  |  |  |  |  |  |  |  |  |  |  |  |  |  |  |  |  |  |  |  |  |  |  |  |  |  |  |  |  |  |  |  |  |  |  |  |  |  |  |  |  |  |
| Aug-14 | 7.7 |  |  |  |  |  |  |  |  |  |  |  |  |  |  |  |  |  |  |  |  |  |  |  |  |  |  |  |  |  |  |  |  |  |  |  |  |  |  |  |  |  |  |  |  |  |  |  |  |  |  |
| Sep-14 | 7 |  |  |  |  |  |  |  |  |  |  |  |  |  |  |  |  |  |  |  |  |  |  |  |  |  |  |  |  |  |  |  |  |  |  |  |  |  |  |  |  |  |  |  |  |  |  |  |  |  |  |
| Oct-14 | 6.4 |  |  |  |  |  |  |  |  |  |  |  |  |  |  |  |  |  |  |  |  |  |  |  |  |  |  |  |  |  |  |  |  |  |  |  |  |  |  |  |  |  |  |  |  |  |  |  |  |  |  |
| Nov-14 | 7.5 |  |  |  |  |  |  |  |  |  |  |  |  |  |  |  |  |  |  |  |  |  |  |  |  |  |  |  |  |  |  |  |  |  |  |  |  |  |  |  |  |  |  |  |  |  |  |  |  |  |  |
| Dec-14 | 8.3 |  |  |  |  |  |  |  |  |  |  |  |  |  |  |  |  |  |  |  |  |  |  |  |  |  |  |  |  |  |  |  |  |  |  |  |  |  |  |  |  |  |  |  |  |  |  |  |  |  |  |
| Jan-15 | 9.8 |  |  |  |  |  |  |  |  |  |  |  |  |  |  |  |  |  |  |  |  |  |  |  |  |  |  |  |  |  |  |  |  |  |  |  |  |  |  |  |  |  |  |  |  |  |  |  |  |  |  |
| Feb-15 | 10.6 |  |  |  |  |  |  |  |  |  |  |  |  |  |  |  |  |  |  |  |  |  |  |  |  |  |  |  |  |  |  |  |  |  |  |  |  |  |  |  |  |  |  |  |  |  |  |  |  |  |  |
| Mar-15 | 9.5 |  |  |  |  |  |  |  |  |  |  |  |  |  |  |  |  |  |  |  |  |  |  |  |  |  |  |  |  |  |  |  |  |  |  |  |  |  |  |  |  |  |  |  |  |  |  |  |  |  |  |
| Apr-15 | 7.5 |  |  |  |  |  |  |  |  |  |  |  |  |  |  |  |  |  |  |  |  |  |  |  |  |  |  |  |  |  |  |  |  |  |  |  |  |  |  |  |  |  |  |  |  |  |  |  |  |  |  |
| May-15 | 6.7 |  |  |  |  |  |  |  |  |  |  |  |  |  |  |  |  |  |  |  |  |  |  |  |  |  |  |  |  |  |  |  |  |  |  |  |  |  |  |  |  |  |  |  |  |  |  |  |  |  |  |
| Jun-15 | 6.3 |  |  |  |  |  |  |  |  |  |  |  |  |  |  |  |  |  |  |  |  |  |  |  |  |  |  |  |  |  |  |  |  |  |  |  |  |  |  |  |  |  |  |  |  |  |  |  |  |  |  |
| Jul-15 | 5.5 |  |  |  |  |  |  |  |  |  |  |  |  |  |  |  |  |  |  |  |  |  |  |  |  |  |  |  |  |  |  |  |  |  |  |  |  |  |  |  |  |  |  |  |  |  |  |  |  |  |  |
| Aug-15 | 6.1 |  |  |  |  |  |  |  |  |  |  |  |  |  |  |  |  |  |  |  |  |  |  |  |  |  |  |  |  |  |  |  |  |  |  |  |  |  |  |  |  |  |  |  |  |  |  |  |  |  |  |
| Sep-15 | 5.5 |  |  |  |  |  |  |  |  |  |  |  |  |  |  |  |  |  |  |  |  |  |  |  |  |  |  |  |  |  |  |  |  |  |  |  |  |  |  |  |  |  |  |  |  |  |  |  |  |  |  |
| Oct-15 | 6.2 |  |  |  |  |  |  |  |  |  |  |  |  |  |  |  |  |  |  |  |  |  |  |  |  |  |  |  |  |  |  |  |  |  |  |  |  |  |  |  |  |  |  |  |  |  |  |  |  |  |  |
| Nov-15 | 6.2 |  |  |  |  |  |  |  |  |  |  |  |  |  |  |  |  |  |  |  |  |  |  |  |  |  |  |  |  |  |  |  |  |  |  |  |  |  |  |  |  |  |  |  |  |  |  |  |  |  |  |
| Dec-15 | 7.5 |  |  |  |  |  |  |  |  |  |  |  |  |  |  |  |  |  |  |  |  |  |  |  |  |  |  |  |  |  |  |  |  |  |  |  |  |  |  |  |  |  |  |  |  |  |  |  |  |  |  |
| Jan-16 | 8.5 |  |  |  |  |  |  |  |  |  |  |  |  |  |  |  |  |  |  |  |  |  |  |  |  |  |  |  |  |  |  |  |  |  |  |  |  |  |  |  |  |  |  |  |  |  |  |  |  |  |  |
| Feb-16 | 8.7 |  |  |  |  |  |  |  |  |  |  |  |  |  |  |  |  |  |  |  |  |  |  |  |  |  |  |  |  |  |  |  |  |  |  |  |  |  |  |  |  |  |  |  |  |  |  |  |  |  |  |
| Mar-16 | 8.7 |  |  |  |  |  |  |  |  |  |  |  |  |  |  |  |  |  |  |  |  |  |  |  |  |  |  |  |  |  |  |  |  |  |  |  |  |  |  |  |  |  |  |  |  |  |  |  |  |  |  |
| Apr-16 | 6 |  |  |  |  |  |  |  |  |  |  |  |  |  |  |  |  |  |  |  |  |  |  |  |  |  |  |  |  |  |  |  |  |  |  |  |  |  |  |  |  |  |  |  |  |  |  |  |  |  |  |
| May-16 | 5.2 |  |  |  |  |  |  |  |  |  |  |  |  |  |  |  |  |  |  |  |  |  |  |  |  |  |  |  |  |  |  |  |  |  |  |  |  |  |  |  |  |  |  |  |  |  |  |  |  |  |  |
| Jun-16 | 4.6 |  |  |  |  |  |  |  |  |  |  |  |  |  |  |  |  |  |  |  |  |  |  |  |  |  |  |  |  |  |  |  |  |  |  |  |  |  |  |  |  |  |  |  |  |  |  |  |  |  |  |
| Jul-16 | 4.5 |  |  |  |  |  |  |  |  |  |  |  |  |  |  |  |  |  |  |  |  |  |  |  |  |  |  |  |  |  |  |  |  |  |  |  |  |  |  |  |  |  |  |  |  |  |  |  |  |  |  |
| Aug-16 | 5.1 |  |  |  |  |  |  |  |  |  |  |  |  |  |  |  |  |  |  |  |  |  |  |  |  |  |  |  |  |  |  |  |  |  |  |  |  |  |  |  |  |  |  |  |  |  |  |  |  |  |  |
| Sep-16 | 5.2 |  |  |  |  |  |  |  |  |  |  |  |  |  |  |  |  |  |  |  |  |  |  |  |  |  |  |  |  |  |  |  |  |  |  |  |  |  |  |  |  |  |  |  |  |  |  |  |  |  |  |
| Oct-16 | 5.7 |  |  |  |  |  |  |  |  |  |  |  |  |  |  |  |  |  |  |  |  |  |  |  |  |  |  |  |  |  |  |  |  |  |  |  |  |  |  |  |  |  |  |  |  |  |  |  |  |  |  |
| Nov-16 | 5.7 |  |  |  |  |  |  |  |  |  |  |  |  |  |  |  |  |  |  |  |  |  |  |  |  |  |  |  |  |  |  |  |  |  |  |  |  |  |  |  |  |  |  |  |  |  |  |  |  |  |  |
| Dec-16 | 7.4 |  |  |  |  |  |  |  |  |  |  |  |  |  |  |  |  |  |  |  |  |  |  |  |  |  |  |  |  |  |  |  |  |  |  |  |  |  |  |  |  |  |  |  |  |  |  |  |  |  |  |
| Jan-17 | 9.4 |  |  |  |  |  |  |  |  |  |  |  |  |  |  |  |  |  |  |  |  |  |  |  |  |  |  |  |  |  |  |  |  |  |  |  |  |  |  |  |  |  |  |  |  |  |  |  |  |  |  |
| Feb-17 | 8.8 |  |  |  |  |  |  |  |  |  |  |  |  |  |  |  |  |  |  |  |  |  |  |  |  |  |  |  |  |  |  |  |  |  |  |  |  |  |  |  |  |  |  |  |  |  |  |  |  |  |  |
| Mar-17 | 8.4 |  |  |  |  |  |  |  |  |  |  |  |  |  |  |  |  |  |  |  |  |  |  |  |  |  |  |  |  |  |  |  |  |  |  |  |  |  |  |  |  |  |  |  |  |  |  |  |  |  |  |
| Apr-17 | 6.3 |  |  |  |  |  |  |  |  |  |  |  |  |  |  |  |  |  |  |  |  |  |  |  |  |  |  |  |  |  |  |  |  |  |  |  |  |  |  |  |  |  |  |  |  |  |  |  |  |  |  |
| May-17 | 5.3 |  |  |  |  |  |  |  |  |  |  |  |  |  |  |  |  |  |  |  |  |  |  |  |  |  |  |  |  |  |  |  |  |  |  |  |  |  |  |  |  |  |  |  |  |  |  |  |  |  |  |
| Jun-17 | 4.5 |  |  |  |  |  |  |  |  |  |  |  |  |  |  |  |  |  |  |  |  |  |  |  |  |  |  |  |  |  |  |  |  |  |  |  |  |  |  |  |  |  |  |  |  |  |  |  |  |  |  |
| Jul-17 | 4.9 |  |  |  |  |  |  |  |  |  |  |  |  |  |  |  |  |  |  |  |  |  |  |  |  |  |  |  |  |  |  |  |  |  |  |  |  |  |  |  |  |  |  |  |  |  |  |  |  |  |  |
| Aug-17 | 4.7 |  |  |  |  |  |  |  |  |  |  |  |  |  |  |  |  |  |  |  |  |  |  |  |  |  |  |  |  |  |  |  |  |  |  |  |  |  |  |  |  |  |  |  |  |  |  |  |  |  |  |
| Sep-17 | 4.7 |  |  |  |  |  |  |  |  |  |  |  |  |  |  |  |  |  |  |  |  |  |  |  |  |  |  |  |  |  |  |  |  |  |  |  |  |  |  |  |  |  |  |  |  |  |  |  |  |  |  |
| Oct-17 | 4.5 |  |  |  |  |  |  |  |  |  |  |  |  |  |  |  |  |  |  |  |  |  |  |  |  |  |  |  |  |  |  |  |  |  |  |  |  |  |  |  |  |  |  |  |  |  |  |  |  |  |  |
| Nov-17 | 5 |  |  |  |  |  |  |  |  |  |  |  |  |  |  |  |  |  |  |  |  |  |  |  |  |  |  |  |  |  |  |  |  |  |  |  |  |  |  |  |  |  |  |  |  |  |  |  |  |  |  |
| Dec-17 | 5.9 |  |  |  |  |  |  |  |  |  |  |  |  |  |  |  |  |  |  |  |  |  |  |  |  |  |  |  |  |  |  |  |  |  |  |  |  |  |  |  |  |  |  |  |  |  |  |  |  |  |  |
| Jan-18 | 7.3 |  |  |  |  |  |  |  |  |  |  |  |  |  |  |  |  |  |  |  |  |  |  |  |  |  |  |  |  |  |  |  |  |  |  |  |  |  |  |  |  |  |  |  |  |  |  |  |  |  |  |
| Feb-18 | 7.8 |  |  |  |  |  |  |  |  |  |  |  |  |  |  |  |  |  |  |  |  |  |  |  |  |  |  |  |  |  |  |  |  |  |  |  |  |  |  |  |  |  |  |  |  |  |  |  |  |  |  |
| Mar-18 | 7.4 |  |  |  |  |  |  |  |  |  |  |  |  |  |  |  |  |  |  |  |  |  |  |  |  |  |  |  |  |  |  |  |  |  |  |  |  |  |  |  |  |  |  |  |  |  |  |  |  |  |  |
| Apr-18 | 6.5 |  |  |  |  |  |  |  |  |  |  |  |  |  |  |  |  |  |  |  |  |  |  |  |  |  |  |  |  |  |  |  |  |  |  |  |  |  |  |  |  |  |  |  |  |  |  |  |  |  |  |
| May-18 | 4.4 |  |  |  |  |  |  |  |  |  |  |  |  |  |  |  |  |  |  |  |  |  |  |  |  |  |  |  |  |  |  |  |  |  |  |  |  |  |  |  |  |  |  |  |  |  |  |  |  |  |  |
| Jun-18 | 4.7 |  |  |  |  |  |  |  |  |  |  |  |  |  |  |  |  |  |  |  |  |  |  |  |  |  |  |  |  |  |  |  |  |  |  |  |  |  |  |  |  |  |  |  |  |  |  |  |  |  |  |
| Jul-18 | 3.4 |  |  |  |  |  |  |  |  |  |  |  |  |  |  |  |  |  |  |  |  |  |  |  |  |  |  |  |  |  |  |  |  |  |  |  |  |  |  |  |  |  |  |  |  |  |  |  |  |  |  |
| Aug-18 | 3.4 |  |  |  |  |  |  |  |  |  |  |  |  |  |  |  |  |  |  |  |  |  |  |  |  |  |  |  |  |  |  |  |  |  |  |  |  |  |  |  |  |  |  |  |  |  |  |  |  |  |  |
| Sep-18 | 4.1 |  |  |  |  |  |  |  |  |  |  |  |  |  |  |  |  |  |  |  |  |  |  |  |  |  |  |  |  |  |  |  |  |  |  |  |  |  |  |  |  |  |  |  |  |  |  |  |  |  |  |
| Oct-18 | 3.6 |  |  |  |  |  |  |  |  |  |  |  |  |  |  |  |  |  |  |  |  |  |  |  |  |  |  |  |  |  |  |  |  |  |  |  |  |  |  |  |  |  |  |  |  |  |  |  |  |  |  |
| Nov-18 | 3.9 |  |  |  |  |  |  |  |  |  |  |  |  |  |  |  |  |  |  |  |  |  |  |  |  |  |  |  |  |  |  |  |  |  |  |  |  |  |  |  |  |  |  |  |  |  |  |  |  |  |  |
| Dec-18 | 5.1 |  |  |  |  |  |  |  |  |  |  |  |  |  |  |  |  |  |  |  |  |  |  |  |  |  |  |  |  |  |  |  |  |  |  |  |  |  |  |  |  |  |  |  |  |  |  |  |  |  |  |
| Jan-19 | 6.4 |  |  |  |  |  |  |  |  |  |  |  |  |  |  |  |  |  |  |  |  |  |  |  |  |  |  |  |  |  |  |  |  |  |  |  |  |  |  |  |  |  |  |  |  |  |  |  |  |  |  |
| Feb-19 | 6.2 |  |  |  |  |  |  |  |  |  |  |  |  |  |  |  |  |  |  |  |  |  |  |  |  |  |  |  |  |  |  |  |  |  |  |  |  |  |  |  |  |  |  |  |  |  |  |  |  |  |  |
| Mar-19 | 5.2 |  |  |  |  |  |  |  |  |  |  |  |  |  |  |  |  |  |  |  |  |  |  |  |  |  |  |  |  |  |  |  |  |  |  |  |  |  |  |  |  |  |  |  |  |  |  |  |  |  |  |
| Apr-19 | 4.7 |  |  |  |  |  |  |  |  |  |  |  |  |  |  |  |  |  |  |  |  |  |  |  |  |  |  |  |  |  |  |  |  |  |  |  |  |  |  |  |  |  |  |  |  |  |  |  |  |  |  |
| May-19 | 3.2 |  |  |  |  |  |  |  |  |  |  |  |  |  |  |  |  |  |  |  |  |  |  |  |  |  |  |  |  |  |  |  |  |  |  |  |  |  |  |  |  |  |  |  |  |  |  |  |  |  |  |
| Jun-19 | 4 |  |  |  |  |  |  |  |  |  |  |  |  |  |  |  |  |  |  |  |  |  |  |  |  |  |  |  |  |  |  |  |  |  |  |  |  |  |  |  |  |  |  |  |  |  |  |  |  |  |  |
| Jul-19 | 3.8 |  |  |  |  |  |  |  |  |  |  |  |  |  |  |  |  |  |  |  |  |  |  |  |  |  |  |  |  |  |  |  |  |  |  |  |  |  |  |  |  |  |  |  |  |  |  |  |  |  |  |
| Aug-19 | 3.6 |  |  |  |  |  |  |  |  |  |  |  |  |  |  |  |  |  |  |  |  |  |  |  |  |  |  |  |  |  |  |  |  |  |  |  |  |  |  |  |  |  |  |  |  |  |  |  |  |  |  |
| Sep-19 | 3.2 |  |  |  |  |  |  |  |  |  |  |  |  |  |  |  |  |  |  |  |  |  |  |  |  |  |  |  |  |  |  |  |  |  |  |  |  |  |  |  |  |  |  |  |  |  |  |  |  |  |  |
| Oct-19 | 4 |  |  |  |  |  |  |  |  |  |  |  |  |  |  |  |  |  |  |  |  |  |  |  |  |  |  |  |  |  |  |  |  |  |  |  |  |  |  |  |  |  |  |  |  |  |  |  |  |  |  |
| Nov-19 | 4.4 |  |  |  |  |  |  |  |  |  |  |  |  |  |  |  |  |  |  |  |  |  |  |  |  |  |  |  |  |  |  |  |  |  |  |  |  |  |  |  |  |  |  |  |  |  |  |  |  |  |  |
| Dec-19 | 5 |  |  |  |  |  |  |  |  |  |  |  |  |  |  |  |  |  |  |  |  |  |  |  |  |  |  |  |  |  |  |  |  |  |  |  |  |  |  |  |  |  |  |  |  |  |  |  |  |  |  |
| Jan-20 | 5.4 |  |  |  |  |  |  |  |  |  |  |  |  |  |  |  |  |  |  |  |  |  |  |  |  |  |  |  |  |  |  |  |  |  |  |  |  |  |  |  |  |  |  |  |  |  |  |  |  |  |  |
| Feb-20 | 5.5 |  |  |  |  |  |  |  |  |  |  |  |  |  |  |  |  |  |  |  |  |  |  |  |  |  |  |  |  |  |  |  |  |  |  |  |  |  |  |  |  |  |  |  |  |  |  |  |  |  |  |
| Mar-20 | 6.9 |  |  |  |  |  |  |  |  |  |  |  |  |  |  |  |  |  |  |  |  |  |  |  |  |  |  |  |  |  |  |  |  |  |  |  |  |  |  |  |  |  |  |  |  |  |  |  |  |  |  |
| Apr-20 | 16.6 |  |  |  |  |  |  |  |  |  |  |  |  |  |  |  |  |  |  |  |  |  |  |  |  |  |  |  |  |  |  |  |  |  |  |  |  |  |  |  |  |  |  |  |  |  |  |  |  |  |  |
| May-20 | 12.7 |  |  |  |  |  |  |  |  |  |  |  |  |  |  |  |  |  |  |  |  |  |  |  |  |  |  |  |  |  |  |  |  |  |  |  |  |  |  |  |  |  |  |  |  |  |  |  |  |  |  |
| Jun-20 | 10.1 |  |  |  |  |  |  |  |  |  |  |  |  |  |  |  |  |  |  |  |  |  |  |  |  |  |  |  |  |  |  |  |  |  |  |  |  |  |  |  |  |  |  |  |  |  |  |  |  |  |  |
| Jul-20 | 8.9 |  |  |  |  |  |  |  |  |  |  |  |  |  |  |  |  |  |  |  |  |  |  |  |  |  |  |  |  |  |  |  |  |  |  |  |  |  |  |  |  |  |  |  |  |  |  |  |  |  |  |
| Aug-20 | 7.6 |  |  |  |  |  |  |  |  |  |  |  |  |  |  |  |  |  |  |  |  |  |  |  |  |  |  |  |  |  |  |  |  |  |  |  |  |  |  |  |  |  |  |  |  |  |  |  |  |  |  |
| Sep-20 | 7.1 |  |  |  |  |  |  |  |  |  |  |  |  |  |  |  |  |  |  |  |  |  |  |  |  |  |  |  |  |  |  |  |  |  |  |  |  |  |  |  |  |  |  |  |  |  |  |  |  |  |  |
| Oct-20 | 6.8 |  |  |  |  |  |  |  |  |  |  |  |  |  |  |  |  |  |  |  |  |  |  |  |  |  |  |  |  |  |  |  |  |  |  |  |  |  |  |  |  |  |  |  |  |  |  |  |  |  |  |
| Nov-20 | 7.3 |  |  |  |  |  |  |  |  |  |  |  |  |  |  |  |  |  |  |  |  |  |  |  |  |  |  |  |  |  |  |  |  |  |  |  |  |  |  |  |  |  |  |  |  |  |  |  |  |  |  |
| Dec-20 | 9.6 |  |  |  |  |  |  |  |  |  |  |  |  |  |  |  |  |  |  |  |  |  |  |  |  |  |  |  |  |  |  |  |  |  |  |  |  |  |  |  |  |  |  |  |  |  |  |  |  |  |  |
| Jan-21 | 9.4 |  |  |  |  |  |  |  |  |  |  |  |  |  |  |  |  |  |  |  |  |  |  |  |  |  |  |  |  |  |  |  |  |  |  |  |  |  |  |  |  |  |  |  |  |  |  |  |  |  |  |
| Feb-21 | 9.6 |  |  |  |  |  |  |  |  |  |  |  |  |  |  |  |  |  |  |  |  |  |  |  |  |  |  |  |  |  |  |  |  |  |  |  |  |  |  |  |  |  |  |  |  |  |  |  |  |  |  |
| Mar-21 | 8.6 |  |  |  |  |  |  |  |  |  |  |  |  |  |  |  |  |  |  |  |  |  |  |  |  |  |  |  |  |  |  |  |  |  |  |  |  |  |  |  |  |  |  |  |  |  |  |  |  |  |  |
| Apr-21 | 7.7 |  |  |  |  |  |  |  |  |  |  |  |  |  |  |  |  |  |  |  |  |  |  |  |  |  |  |  |  |  |  |  |  |  |  |  |  |  |  |  |  |  |  |  |  |  |  |  |  |  |  |
| May-21 | 6.7 |  |  |  |  |  |  |  |  |  |  |  |  |  |  |  |  |  |  |  |  |  |  |  |  |  |  |  |  |  |  |  |  |  |  |  |  |  |  |  |  |  |  |  |  |  |  |  |  |  |  |
| Jun-21 | 7.5 |  |  |  |  |  |  |  |  |  |  |  |  |  |  |  |  |  |  |  |  |  |  |  |  |  |  |  |  |  |  |  |  |  |  |  |  |  |  |  |  |  |  |  |  |  |  |  |  |  |  |
| Jul-21 | 6.1 |  |  |  |  |  |  |  |  |  |  |  |  |  |  |  |  |  |  |  |  |  |  |  |  |  |  |  |  |  |  |  |  |  |  |  |  |  |  |  |  |  |  |  |  |  |  |  |  |  |  |
| Aug-21 | 4.6 |  |  |  |  |  |  |  |  |  |  |  |  |  |  |  |  |  |  |  |  |  |  |  |  |  |  |  |  |  |  |  |  |  |  |  |  |  |  |  |  |  |  |  |  |  |  |  |  |  |  |
| Sep-21 | 4.5 |  |  |  |  |  |  |  |  |  |  |  |  |  |  |  |  |  |  |  |  |  |  |  |  |  |  |  |  |  |  |  |  |  |  |  |  |  |  |  |  |  |  |  |  |  |  |  |  |  |  |
| Oct-21 | 4 |  |  |  |  |  |  |  |  |  |  |  |  |  |  |  |  |  |  |  |  |  |  |  |  |  |  |  |  |  |  |  |  |  |  |  |  |  |  |  |  |  |  |  |  |  |  |  |  |  |  |
| Nov-21 | 4.7 |  |  |  |  |  |  |  |  |  |  |  |  |  |  |  |  |  |  |  |  |  |  |  |  |  |  |  |  |  |  |  |  |  |  |  |  |  |  |  |  |  |  |  |  |  |  |  |  |  |  |
| Dec-21 | 5 |  |  |  |  |  |  |  |  |  |  |  |  |  |  |  |  |  |  |  |  |  |  |  |  |  |  |  |  |  |  |  |  |  |  |  |  |  |  |  |  |  |  |  |  |  |  |  |  |  |  |
| Jan-22 | 7.1 |  |  |  |  |  |  |  |  |  |  |  |  |  |  |  |  |  |  |  |  |  |  |  |  |  |  |  |  |  |  |  |  |  |  |  |  |  |  |  |  |  |  |  |  |  |  |  |  |  |  |
| Feb-22 | 6.7 |  |  |  |  |  |  |  |  |  |  |  |  |  |  |  |  |  |  |  |  |  |  |  |  |  |  |  |  |  |  |  |  |  |  |  |  |  |  |  |  |  |  |  |  |  |  |  |  |  |  |
| Mar-22 | 6 |  |  |  |  |  |  |  |  |  |  |  |  |  |  |  |  |  |  |  |  |  |  |  |  |  |  |  |  |  |  |  |  |  |  |  |  |  |  |  |  |  |  |  |  |  |  |  |  |  |  |
| Apr-22 | 4.6 |  |  |  |  |  |  |  |  |  |  |  |  |  |  |  |  |  |  |  |  |  |  |  |  |  |  |  |  |  |  |  |  |  |  |  |  |  |  |  |  |  |  |  |  |  |  |  |  |  |  |
| May-22 | 3.8 |  |  |  |  |  |  |  |  |  |  |  |  |  |  |  |  |  |  |  |  |  |  |  |  |  |  |  |  |  |  |  |  |  |  |  |  |  |  |  |  |  |  |  |  |  |  |  |  |  |  |
| Jun-22 | 3.7 |  |  |  |  |  |  |  |  |  |  |  |  |  |  |  |  |  |  |  |  |  |  |  |  |  |  |  |  |  |  |  |  |  |  |  |  |  |  |  |  |  |  |  |  |  |  |  |  |  |  |
| Jul-22 | 3.5 |  |  |  |  |  |  |  |  |  |  |  |  |  |  |  |  |  |  |  |  |  |  |  |  |  |  |  |  |  |  |  |  |  |  |  |  |  |  |  |  |  |  |  |  |  |  |  |  |  |  |
| Aug-22 | 3.9 |  |  |  |  |  |  |  |  |  |  |  |  |  |  |  |  |  |  |  |  |  |  |  |  |  |  |  |  |  |  |  |  |  |  |  |  |  |  |  |  |  |  |  |  |  |  |  |  |  |  |
| Sep-22 | 3.4 |  |  |  |  |  |  |  |  |  |  |  |  |  |  |  |  |  |  |  |  |  |  |  |  |  |  |  |  |  |  |  |  |  |  |  |  |  |  |  |  |  |  |  |  |  |  |  |  |  |  |
| Oct-22 | 4.1 |  |  |  |  |  |  |  |  |  |  |  |  |  |  |  |  |  |  |  |  |  |  |  |  |  |  |  |  |  |  |  |  |  |  |  |  |  |  |  |  |  |  |  |  |  |  |  |  |  |  |
| Nov-22 | 3.9 |  |  |  |  |  |  |  |  |  |  |  |  |  |  |  |  |  |  |  |  |  |  |  |  |  |  |  |  |  |  |  |  |  |  |  |  |  |  |  |  |  |  |  |  |  |  |  |  |  |  |
| Dec-22 | 4.4 |  |  |  |  |  |  |  |  |  |  |  |  |  |  |  |  |  |  |  |  |  |  |  |  |  |  |  |  |  |  |  |  |  |  |  |  |  |  |  |  |  |  |  |  |  |  |  |  |  |  |
| Jan-23 | 6.9 |  |  |  |  |  |  |  |  |  |  |  |  |  |  |  |  |  |  |  |  |  |  |  |  |  |  |  |  |  |  |  |  |  |  |  |  |  |  |  |  |  |  |  |  |  |  |  |  |  |  |
| Feb-23 | 6.6 |  |  |  |  |  |  |  |  |  |  |  |  |  |  |  |  |  |  |  |  |  |  |  |  |  |  |  |  |  |  |  |  |  |  |  |  |  |  |  |  |  |  |  |  |  |  |  |  |  |  |
| Mar-23 | 5.6 |  |  |  |  |  |  |  |  |  |  |  |  |  |  |  |  |  |  |  |  |  |  |  |  |  |  |  |  |  |  |  |  |  |  |  |  |  |  |  |  |  |  |  |  |  |  |  |  |  |  |
| Apr-23 | 4.1 |  |  |  |  |  |  |  |  |  |  |  |  |  |  |  |  |  |  |  |  |  |  |  |  |  |  |  |  |  |  |  |  |  |  |  |  |  |  |  |  |  |  |  |  |  |  |  |  |  |  |
| May-23 | 3.5 |  |  |  |  |  |  |  |  |  |  |  |  |  |  |  |  |  |  |  |  |  |  |  |  |  |  |  |  |  |  |  |  |  |  |  |  |  |  |  |  |  |  |  |  |  |  |  |  |  |  |
| Jun-23 | 3.6 |  |  |  |  |  |  |  |  |  |  |  |  |  |  |  |  |  |  |  |  |  |  |  |  |  |  |  |  |  |  |  |  |  |  |  |  |  |  |  |  |  |  |  |  |  |  |  |  |  |  |
| Jul-23 | 3.9 |  |  |  |  |  |  |  |  |  |  |  |  |  |  |  |  |  |  |  |  |  |  |  |  |  |  |  |  |  |  |  |  |  |  |  |  |  |  |  |  |  |  |  |  |  |  |  |  |  |  |
| Aug-23 | 3.9 |  |  |  |  |  |  |  |  |  |  |  |  |  |  |  |  |  |  |  |  |  |  |  |  |  |  |  |  |  |  |  |  |  |  |  |  |  |  |  |  |  |  |  |  |  |  |  |  |  |  |
| Sep-23 | 3.8 |  |  |  |  |  |  |  |  |  |  |  |  |  |  |  |  |  |  |  |  |  |  |  |  |  |  |  |  |  |  |  |  |  |  |  |  |  |  |  |  |  |  |  |  |  |  |  |  |  |  |
| Oct-23 | 4 |  |  |  |  |  |  |  |  |  |  |  |  |  |  |  |  |  |  |  |  |  |  |  |  |  |  |  |  |  |  |  |  |  |  |  |  |  |  |  |  |  |  |  |  |  |  |  |  |  |  |
| Nov-23 | 4.8 |  |  |  |  |  |  |  |  |  |  |  |  |  |  |  |  |  |  |  |  |  |  |  |  |  |  |  |  |  |  |  |  |  |  |  |  |  |  |  |  |  |  |  |  |  |  |  |  |  |  |
| Dec-23 | 4.4 |  |  |  |  |  |  |  |  |  |  |  |  |  |  |  |  |  |  |  |  |  |  |  |  |  |  |  |  |  |  |  |  |  |  |  |  |  |  |  |  |  |  |  |  |  |  |  |  |  |  |
| Jan-24 | 6.9 |  |  |  |  |  |  |  |  |  |  |  |  |  |  |  |  |  |  |  |  |  |  |  |  |  |  |  |  |  |  |  |  |  |  |  |  |  |  |  |  |  |  |  |  |  |  |  |  |  |  |
| Feb-24 | 7 |  |  |  |  |  |  |  |  |  |  |  |  |  |  |  |  |  |  |  |  |  |  |  |  |  |  |  |  |  |  |  |  |  |  |  |  |  |  |  |  |  |  |  |  |  |  |  |  |  |  |
| Mar-24 | 5.4 |  |  |  |  |  |  |  |  |  |  |  |  |  |  |  |  |  |  |  |  |  |  |  |  |  |  |  |  |  |  |  |  |  |  |  |  |  |  |  |  |  |  |  |  |  |  |  |  |  |  |
| Apr-24 | 5.2 |  |  |  |  |  |  |  |  |  |  |  |  |  |  |  |  |  |  |  |  |  |  |  |  |  |  |  |  |  |  |  |  |  |  |  |  |  |  |  |  |  |  |  |  |  |  |  |  |  |  |
| May-24 | 3.9 |  |  |  |  |  |  |  |  |  |  |  |  |  |  |  |  |  |  |  |  |  |  |  |  |  |  |  |  |  |  |  |  |  |  |  |  |  |  |  |  |  |  |  |  |  |  |  |  |  |  |
| Jun-24 | 3.3 |  |  |  |  |  |  |  |  |  |  |  |  |  |  |  |  |  |  |  |  |  |  |  |  |  |  |  |  |  |  |  |  |  |  |  |  |  |  |  |  |  |  |  |  |  |  |  |  |  |  |